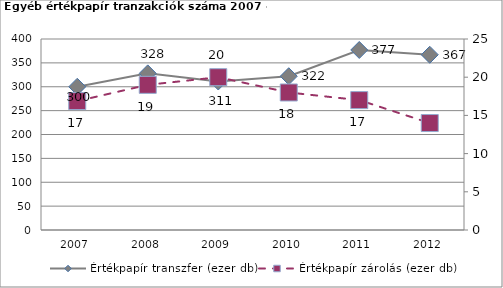
| Category | Értékpapír transzfer (ezer db) |
|---|---|
| 2007.0 | 299.947 |
| 2008.0 | 328 |
| 2009.0 | 311 |
| 2010.0 | 322 |
| 2011.0 | 377 |
| 2012.0 | 367 |